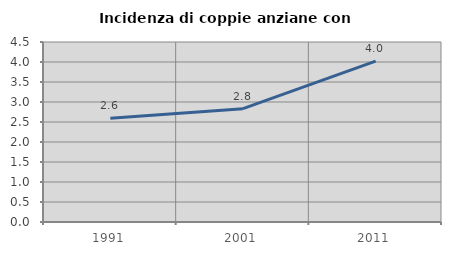
| Category | Incidenza di coppie anziane con figli |
|---|---|
| 1991.0 | 2.595 |
| 2001.0 | 2.834 |
| 2011.0 | 4.02 |